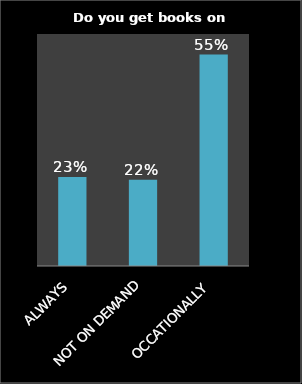
| Category | Series 0 |
|---|---|
| ALWAYS | 0.23 |
| NOT ON DEMAND | 0.223 |
| OCCATIONALLY | 0.547 |